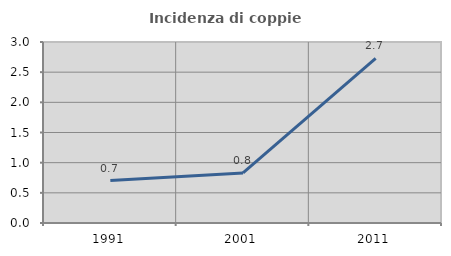
| Category | Incidenza di coppie miste |
|---|---|
| 1991.0 | 0.703 |
| 2001.0 | 0.83 |
| 2011.0 | 2.727 |